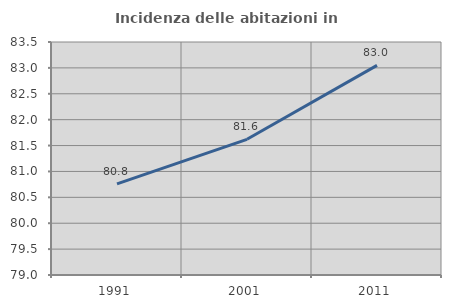
| Category | Incidenza delle abitazioni in proprietà  |
|---|---|
| 1991.0 | 80.761 |
| 2001.0 | 81.621 |
| 2011.0 | 83.048 |